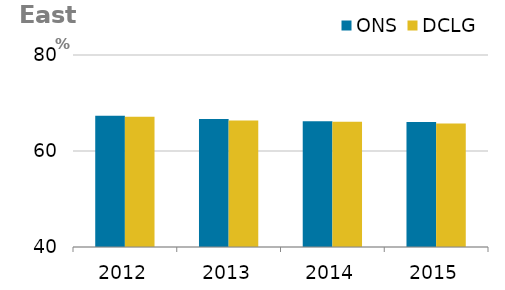
| Category | ONS | DCLG |
|---|---|---|
| 0 | 67.33 | 67.16 |
| 1 | 66.69 | 66.352 |
| 2 | 66.2 | 66.113 |
| 3 | 66.03 | 65.739 |